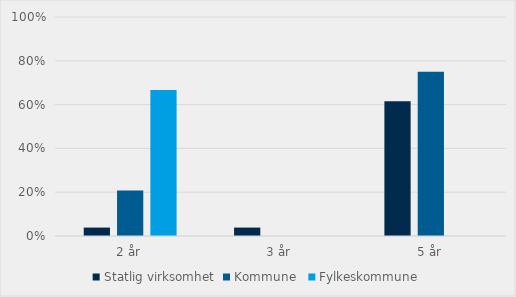
| Category | Statlig virksomhet | Kommune  | Fylkeskommune |
|---|---|---|---|
| 2 år | 0.038 | 0.208 | 0.667 |
| 3 år | 0.038 | 0 | 0 |
| 5 år | 0.615 | 0.75 | 0 |